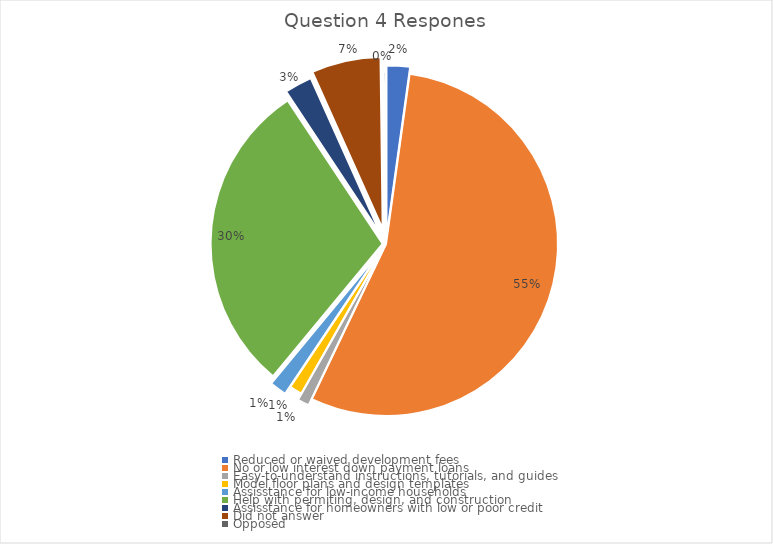
| Category | Series 0 | Series 1 |
|---|---|---|
| Reduced or waived development fees | 22 | 0.022 |
| No or low interest down payment loans | 549 | 0.549 |
| Easy-to-understand instructions, tutorials, and guides | 11 | 0.011 |
| Model floor plans and design templates | 12 | 0.012 |
| Assisstance for low-income households | 16 | 0.016 |
| Help with permiting, design, and construction | 297 | 0.297 |
| Assisstance for homeowners with low or poor credit | 26 | 0.026 |
| Did not answer | 65 | 0.065 |
| Opposed | 2 | 0.002 |